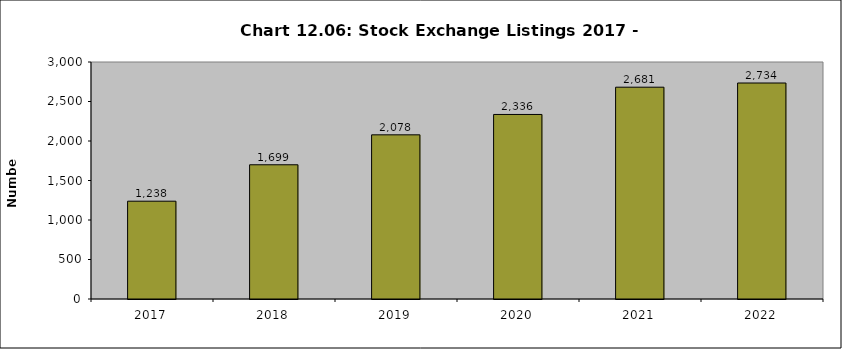
| Category | Series 0 |
|---|---|
| 2017.0 | 1238 |
| 2018.0 | 1699 |
| 2019.0 | 2078 |
| 2020.0 | 2336 |
| 2021.0 | 2681 |
| 2022.0 | 2734 |